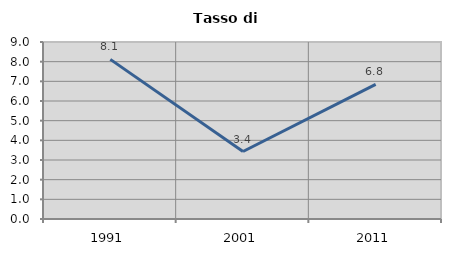
| Category | Tasso di disoccupazione   |
|---|---|
| 1991.0 | 8.116 |
| 2001.0 | 3.432 |
| 2011.0 | 6.845 |